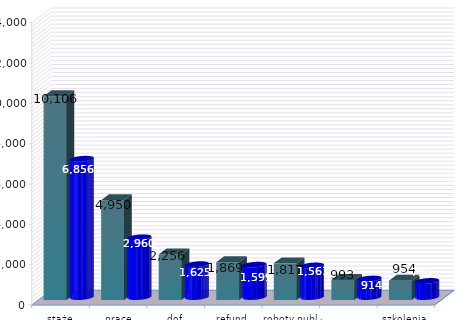
| Category | 7 podstawowych form - rozpoczęcie | 7 podstawowych form - graduacja |
|---|---|---|
| staże | 10106 | 6856 |
| prace interw. | 4950 | 2960 |
| dof. działaln. | 2256 | 1625 |
| refund. koszt. | 1869 | 1599 |
| roboty publ. | 1817 | 1561 |
| bon na zas. | 993 | 914 |
| szkolenia | 954 | 793 |